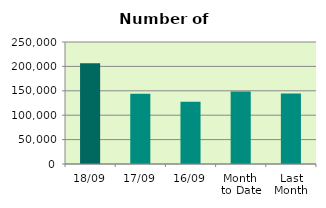
| Category | Series 0 |
|---|---|
| 18/09 | 206240 |
| 17/09 | 143826 |
| 16/09 | 127418 |
| Month 
to Date | 148357.571 |
| Last
Month | 144368.095 |